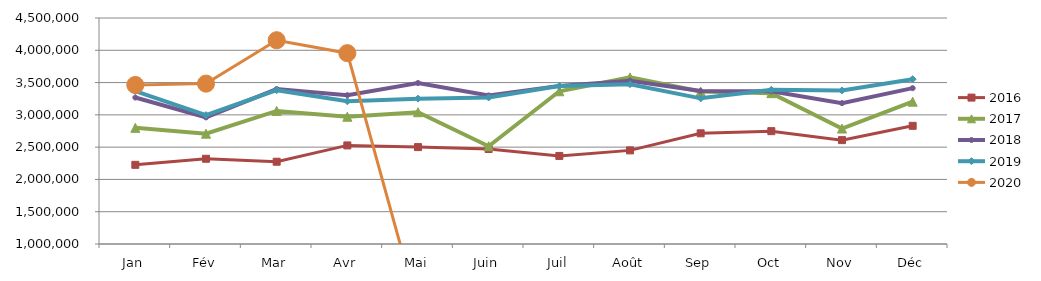
| Category | 2015 | 2016 | 2017 | 2018 | 2019 | 2020 |
|---|---|---|---|---|---|---|
| Jan |  | 2226093.309 | 2798915.391 | 3268127.156 | 3367510.542 | 3462441.736 |
| Fév |  | 2320135.002 | 2708507.11 | 2960518.709 | 2995707.194 | 3483671.962 |
| Mar |  | 2274111.99 | 3061215.361 | 3399788.443 | 3382590.899 | 4155467.912 |
| Avr |  | 2526794.87 | 2970911.094 | 3304906.324 | 3209954.832 | 3955618.656 |
| Mai |  | 2500868.782 | 3040805.262 | 3492911.082 | 3251146.092 | 0 |
| Juin |  | 2471115.702 | 2513480.318 | 3300924.802 | 3269085.474 | 0 |
| Juil |  | 2363852.978 | 3365511.031 | 3448603.566 | 3445052.713 | 0 |
| Août |  | 2449927.953 | 3580436.797 | 3528173.012 | 3474993.525 | 0 |
| Sep |  | 2714390.875 | 3361524.335 | 3369626.193 | 3255644.054 | 0 |
| Oct |  | 2747632.929 | 3335934.501 | 3364260.879 | 3388972.2 | 0 |
| Nov |  | 2608583.302 | 2787992.168 | 3181888.576 | 3378477.919 | 0 |
| Déc |  | 2830164.13 | 3203732.398 | 3413454.996 | 3552894.26 | 0 |